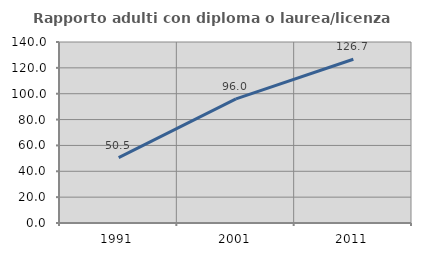
| Category | Rapporto adulti con diploma o laurea/licenza media  |
|---|---|
| 1991.0 | 50.512 |
| 2001.0 | 95.95 |
| 2011.0 | 126.654 |